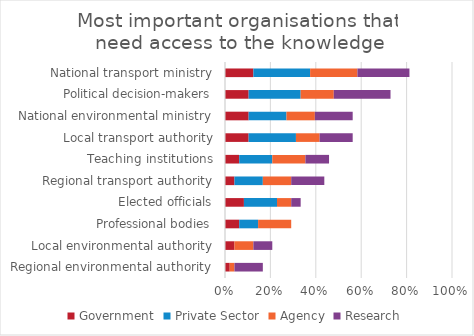
| Category | Government | Private Sector | Agency | Research |
|---|---|---|---|---|
| Regional environmental authority | 0.021 | 0 | 0.021 | 0.125 |
| Local environmental authority | 0.042 | 0 | 0.083 | 0.083 |
| Professional bodies | 0.062 | 0.083 | 0.146 | 0 |
| Elected officials | 0.083 | 0.146 | 0.062 | 0.042 |
| Regional transport authority | 0.042 | 0.125 | 0.125 | 0.146 |
| Teaching institutions | 0.062 | 0.146 | 0.146 | 0.104 |
| Local transport authority | 0.104 | 0.208 | 0.104 | 0.146 |
| National environmental ministry | 0.104 | 0.167 | 0.125 | 0.167 |
| Political decision-makers | 0.104 | 0.229 | 0.146 | 0.25 |
| National transport ministry | 0.125 | 0.25 | 0.208 | 0.229 |